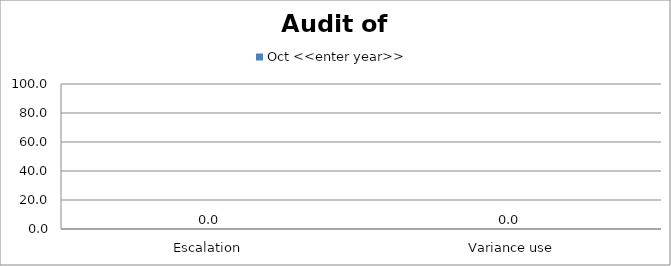
| Category | Oct <<enter year>> |
|---|---|
| Escalation  | 0 |
|  Variance use | 0 |